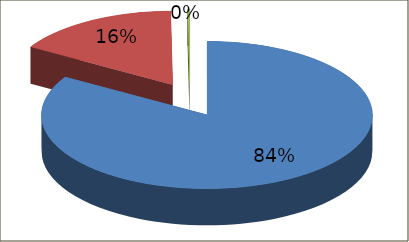
| Category | Series 0 |
|---|---|
| 1.0 | 16481904 |
| 2.0 | 3195749 |
| 3.0 | 38375 |